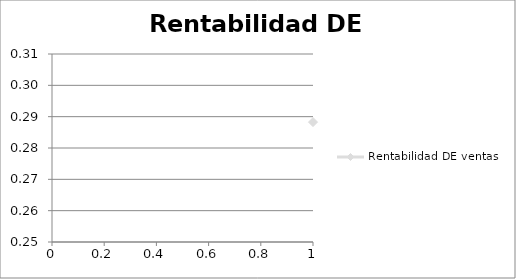
| Category | Rentabilidad DE ventas |
|---|---|
| 0 | 0.288 |
| 1 | 0.252 |
| 2 | 0.288 |
| 3 | 0.289 |
| 4 | 0.295 |
| 5 | 0.297 |
| 6 | 0.295 |
| 7 | 0.298 |